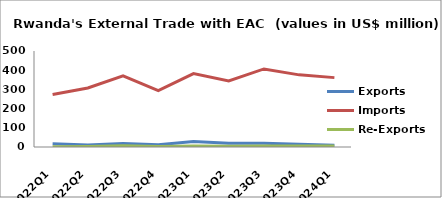
| Category | Exports | Imports | Re-Exports |
|---|---|---|---|
| 2022Q1 | 16.467 | 273.874 | 1.717 |
| 2022Q2 | 10.962 | 307.653 | 3.227 |
| 2022Q3 | 18.607 | 371.029 | 5.913 |
| 2022Q4 | 11.691 | 294.166 | 2.456 |
| 2023Q1 | 28.708 | 382.295 | 4.582 |
| 2023Q2 | 19.479 | 344.376 | 3.772 |
| 2023Q3 | 19.264 | 406.611 | 4.929 |
| 2023Q4 | 13.727 | 375.756 | 4.689 |
| 2024Q1 | 8.936 | 361.316 | 5.603 |